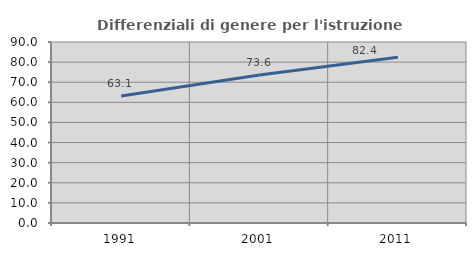
| Category | Differenziali di genere per l'istruzione superiore |
|---|---|
| 1991.0 | 63.116 |
| 2001.0 | 73.598 |
| 2011.0 | 82.399 |